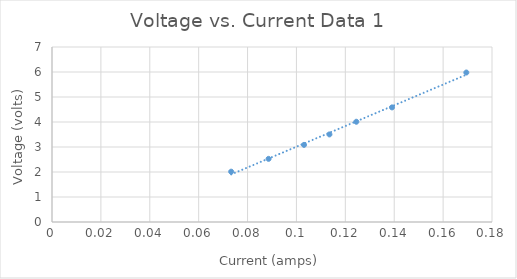
| Category | Series 0 |
|---|---|
| 0.0733 | 2.013 |
| 0.0886 | 2.526 |
| 0.1031 | 3.085 |
| 0.1135 | 3.503 |
| 0.1245 | 4.01 |
| 0.1391 | 4.584 |
| 0.1695 | 5.979 |